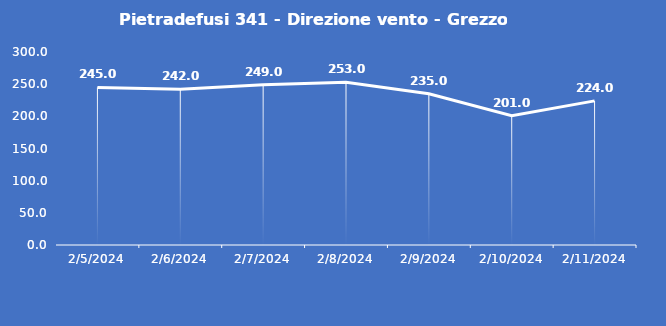
| Category | Pietradefusi 341 - Direzione vento - Grezzo (°N) |
|---|---|
| 2/5/24 | 245 |
| 2/6/24 | 242 |
| 2/7/24 | 249 |
| 2/8/24 | 253 |
| 2/9/24 | 235 |
| 2/10/24 | 201 |
| 2/11/24 | 224 |